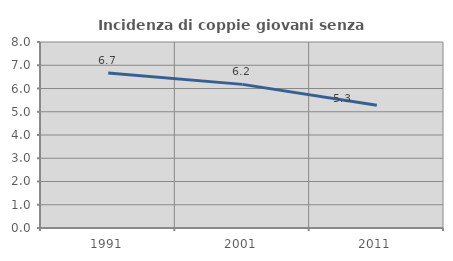
| Category | Incidenza di coppie giovani senza figli |
|---|---|
| 1991.0 | 6.667 |
| 2001.0 | 6.178 |
| 2011.0 | 5.28 |